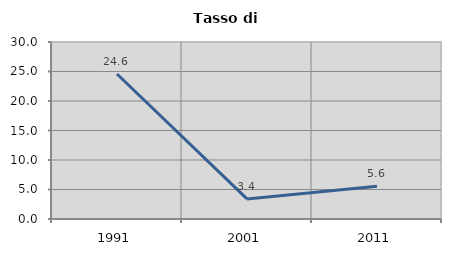
| Category | Tasso di disoccupazione   |
|---|---|
| 1991.0 | 24.576 |
| 2001.0 | 3.409 |
| 2011.0 | 5.556 |